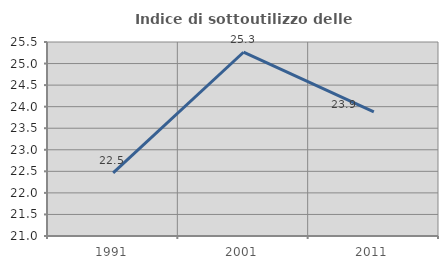
| Category | Indice di sottoutilizzo delle abitazioni  |
|---|---|
| 1991.0 | 22.463 |
| 2001.0 | 25.263 |
| 2011.0 | 23.881 |